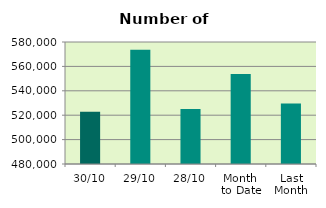
| Category | Series 0 |
|---|---|
| 30/10 | 522778 |
| 29/10 | 573670 |
| 28/10 | 525006 |
| Month 
to Date | 553730.727 |
| Last
Month | 529677.905 |